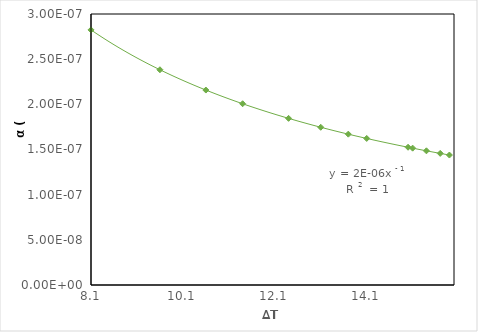
| Category | Series 0 |
|---|---|
| 8.100000000000001 | 0 |
| 9.600000000000001 | 0 |
| 10.600000000000001 | 0 |
| 11.400000000000006 | 0 |
| 12.399999999999999 | 0 |
| 13.100000000000001 | 0 |
| 13.700000000000003 | 0 |
| 14.099999999999994 | 0 |
| 15.100000000000009 | 0 |
| 15.399999999999991 | 0 |
| 15.899999999999991 | 0 |
| 15.700000000000003 | 0 |
| 15.0 | 0 |